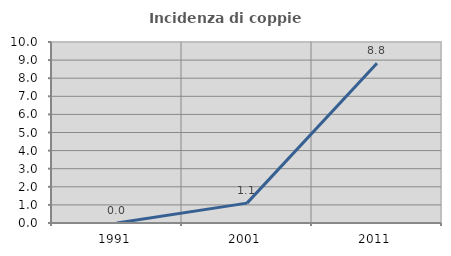
| Category | Incidenza di coppie miste |
|---|---|
| 1991.0 | 0 |
| 2001.0 | 1.099 |
| 2011.0 | 8.824 |